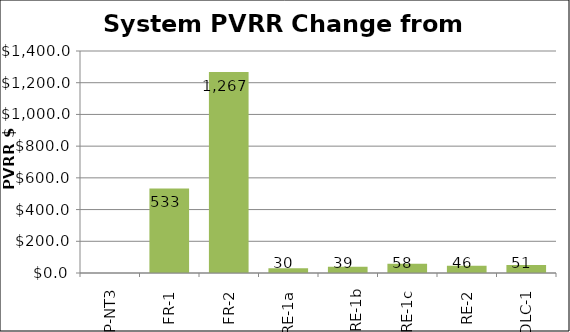
| Category | Total |
|---|---|
| OP-NT3 | 0 |
| FR-1 | 533.278 |
| FR-2 | 1266.823 |
| RE-1a | 30.379 |
| 
RE-1b | 38.892 |
| RE-1c | 57.68 |
| RE-2 | 45.969 |
| DLC-1 | 51.05 |